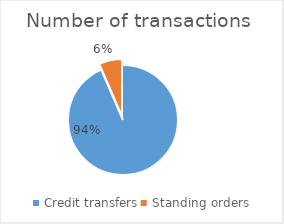
| Category | Number of transactions  |
|---|---|
| Credit transfers | 356115102 |
| Standing orders | 24680635 |